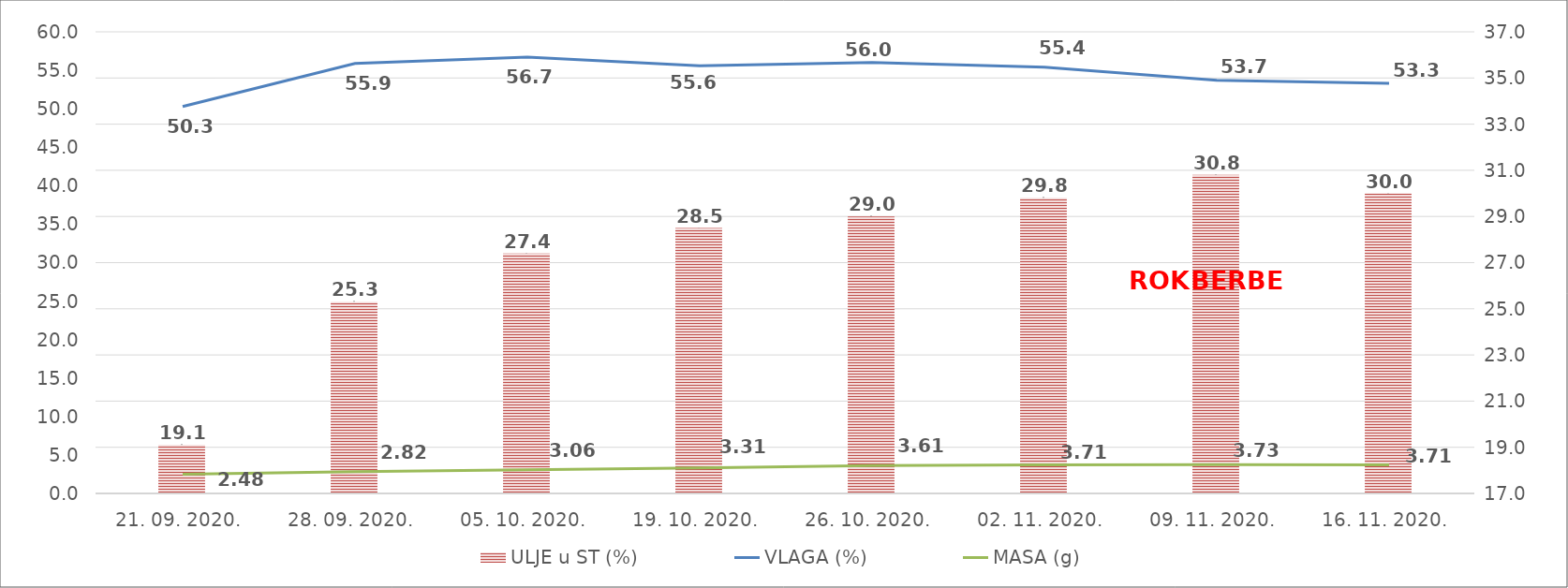
| Category | ULJE u ST (%) |
|---|---|
| 21. 09. 2020. | 19.1 |
| 28. 09. 2020. | 25.3 |
| 05. 10. 2020. | 27.4 |
| 19. 10. 2020. | 28.5 |
| 26. 10. 2020. | 29 |
| 02. 11. 2020. | 29.8 |
| 09. 11. 2020. | 30.8 |
| 16. 11. 2020. | 30 |